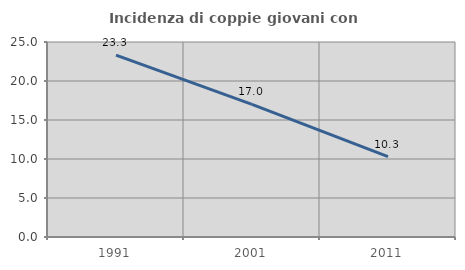
| Category | Incidenza di coppie giovani con figli |
|---|---|
| 1991.0 | 23.328 |
| 2001.0 | 17.01 |
| 2011.0 | 10.294 |